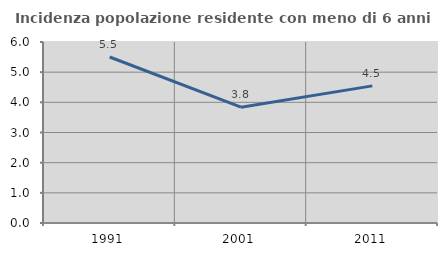
| Category | Incidenza popolazione residente con meno di 6 anni |
|---|---|
| 1991.0 | 5.503 |
| 2001.0 | 3.838 |
| 2011.0 | 4.545 |